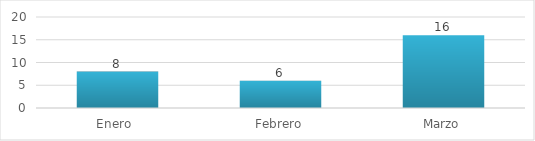
| Category | Series 0 |
|---|---|
| Enero  | 8 |
| Febrero | 6 |
| Marzo | 16 |